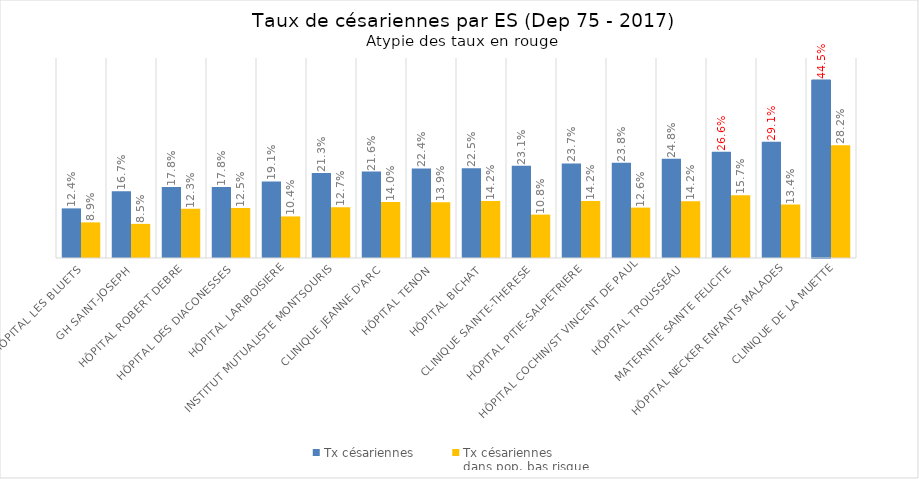
| Category | Tx césariennes | Tx césariennes 
dans pop. bas risque |
|---|---|---|
| HÔPITAL LES BLUETS | 0.124 | 0.089 |
| GH SAINT-JOSEPH | 0.167 | 0.085 |
| HÔPITAL ROBERT DEBRE | 0.178 | 0.123 |
| HÔPITAL DES DIACONESSES | 0.178 | 0.125 |
| HÔPITAL LARIBOISIERE | 0.191 | 0.104 |
| INSTITUT MUTUALISTE MONTSOURIS | 0.213 | 0.127 |
| CLINIQUE JEANNE D'ARC | 0.216 | 0.14 |
| HÔPITAL TENON | 0.224 | 0.139 |
| HÔPITAL BICHAT | 0.225 | 0.142 |
| CLINIQUE SAINTE-THERESE | 0.231 | 0.108 |
| HÔPITAL PITIE-SALPETRIERE | 0.237 | 0.142 |
| HÔPITAL COCHIN/ST VINCENT DE PAUL | 0.238 | 0.126 |
| HÔPITAL TROUSSEAU | 0.248 | 0.142 |
| MATERNITE SAINTE FELICITE | 0.266 | 0.157 |
| HÔPITAL NECKER ENFANTS MALADES | 0.291 | 0.134 |
| CLINIQUE DE LA MUETTE | 0.445 | 0.282 |